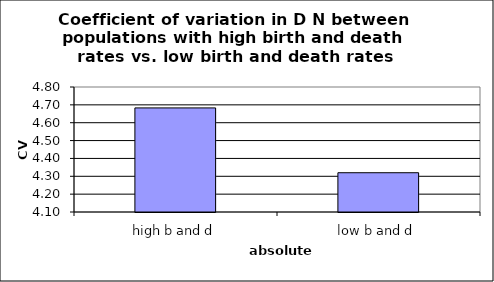
| Category | Series 0 |
|---|---|
| 0 | 4.683 |
| 1 | 4.32 |